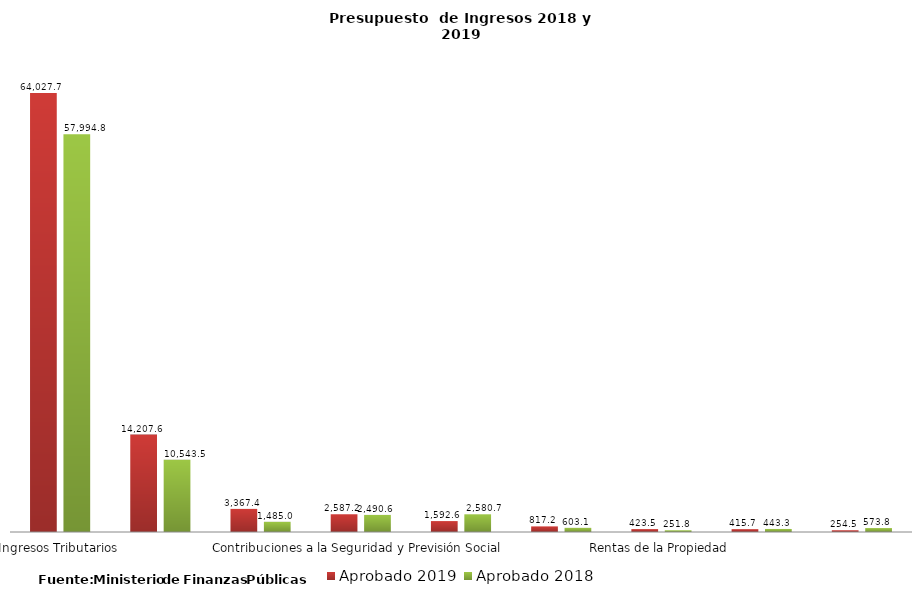
| Category | Aprobado 2019 | Aprobado 2018 |
|---|---|---|
| Ingresos Tributarios | 64027.7 | 57994.8 |
| Colocación de Bonos | 14207.6 | 10543.5 |
| Saldos de Caja | 3367.4 | 1485 |
| Contribuciones a la Seguridad y Previsión Social  | 2587.2 | 2490.6 |
| Préstamos Externos | 1592.6 | 2580.7 |
| Ingresos no Tributarios | 817.2 | 603.1 |
| Rentas de la Propiedad | 423.5 | 251.8 |
| Vta. De Bienes y Servicios de la Adm. Pública | 415.7 | 443.3 |
| Donaciones | 254.5 | 573.8 |